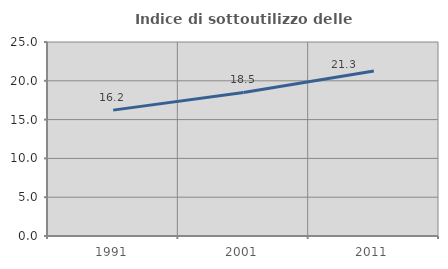
| Category | Indice di sottoutilizzo delle abitazioni  |
|---|---|
| 1991.0 | 16.22 |
| 2001.0 | 18.5 |
| 2011.0 | 21.254 |